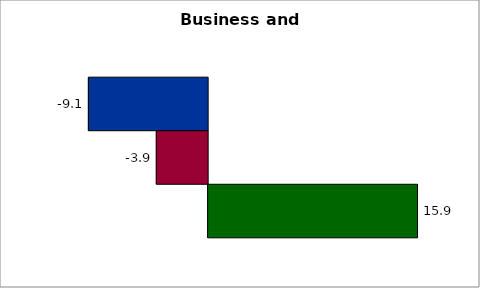
| Category | 50 states and D.C. | SREB states | State |
|---|---|---|---|
| 0 | -9.074 | -3.906 | 15.93 |